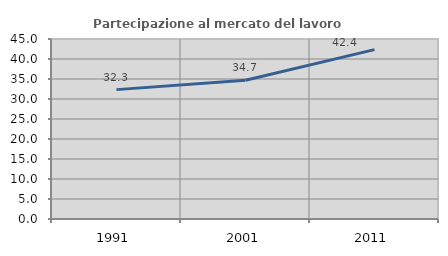
| Category | Partecipazione al mercato del lavoro  femminile |
|---|---|
| 1991.0 | 32.344 |
| 2001.0 | 34.671 |
| 2011.0 | 42.353 |